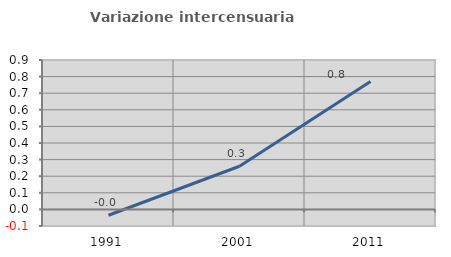
| Category | Variazione intercensuaria annua |
|---|---|
| 1991.0 | -0.035 |
| 2001.0 | 0.26 |
| 2011.0 | 0.771 |